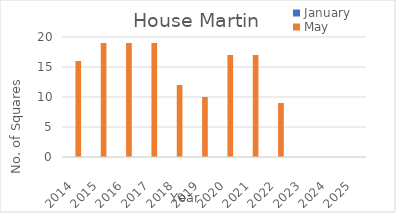
| Category | January | May |
|---|---|---|
| 2014.0 | 0 | 16 |
| 2015.0 | 0 | 19 |
| 2016.0 | 0 | 19 |
| 2017.0 | 0 | 19 |
| 2018.0 | 0 | 12 |
| 2019.0 | 0 | 10 |
| 2020.0 | 0 | 17 |
| 2021.0 | 0 | 17 |
| 2022.0 | 0 | 9 |
| 2023.0 | 0 | 0 |
| 2024.0 | 0 | 0 |
| 2025.0 | 0 | 0 |